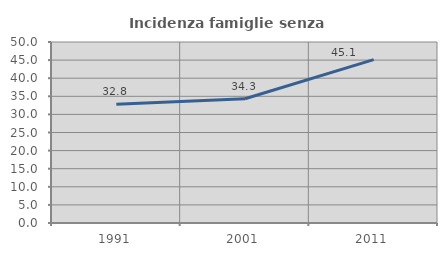
| Category | Incidenza famiglie senza nuclei |
|---|---|
| 1991.0 | 32.828 |
| 2001.0 | 34.328 |
| 2011.0 | 45.146 |